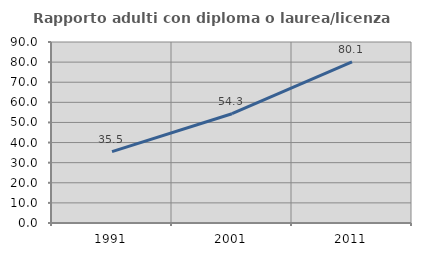
| Category | Rapporto adulti con diploma o laurea/licenza media  |
|---|---|
| 1991.0 | 35.457 |
| 2001.0 | 54.339 |
| 2011.0 | 80.147 |